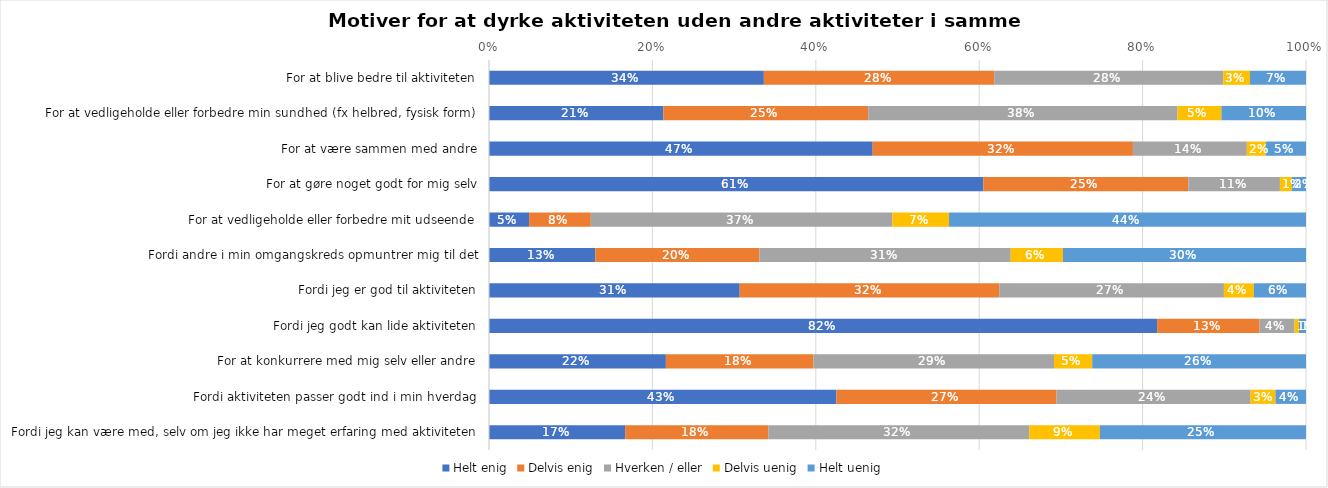
| Category | Helt enig | Delvis enig | Hverken / eller | Delvis uenig | Helt uenig |
|---|---|---|---|---|---|
| For at blive bedre til aktiviteten | 0.336 | 0.282 | 0.28 | 0.033 | 0.069 |
| For at vedligeholde eller forbedre min sundhed (fx helbred, fysisk form) | 0.213 | 0.251 | 0.379 | 0.054 | 0.104 |
| For at være sammen med andre | 0.47 | 0.319 | 0.139 | 0.023 | 0.049 |
| For at gøre noget godt for mig selv | 0.605 | 0.251 | 0.112 | 0.015 | 0.017 |
| For at vedligeholde eller forbedre mit udseende | 0.049 | 0.076 | 0.369 | 0.069 | 0.437 |
| Fordi andre i min omgangskreds opmuntrer mig til det | 0.13 | 0.201 | 0.308 | 0.064 | 0.298 |
| Fordi jeg er god til aktiviteten | 0.307 | 0.318 | 0.275 | 0.037 | 0.064 |
| Fordi jeg godt kan lide aktiviteten | 0.818 | 0.125 | 0.043 | 0.005 | 0.009 |
| For at konkurrere med mig selv eller andre | 0.217 | 0.181 | 0.294 | 0.047 | 0.262 |
| Fordi aktiviteten passer godt ind i min hverdag | 0.425 | 0.269 | 0.238 | 0.03 | 0.037 |
| Fordi jeg kan være med, selv om jeg ikke har meget erfaring med aktiviteten | 0.167 | 0.175 | 0.319 | 0.086 | 0.252 |